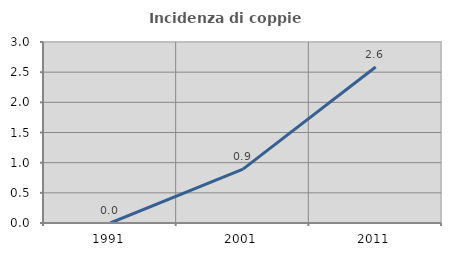
| Category | Incidenza di coppie miste |
|---|---|
| 1991.0 | 0 |
| 2001.0 | 0.893 |
| 2011.0 | 2.586 |